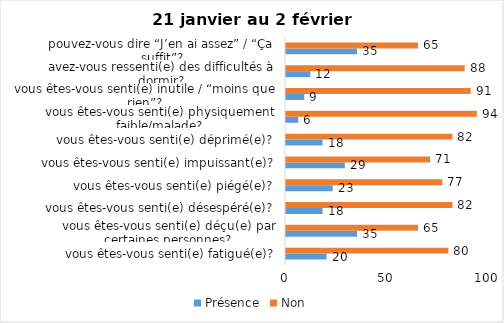
| Category | Présence | Non |
|---|---|---|
| vous êtes-vous senti(e) fatigué(e)? | 20 | 80 |
| vous êtes-vous senti(e) déçu(e) par certaines personnes? | 35 | 65 |
| vous êtes-vous senti(e) désespéré(e)? | 18 | 82 |
| vous êtes-vous senti(e) piégé(e)? | 23 | 77 |
| vous êtes-vous senti(e) impuissant(e)? | 29 | 71 |
| vous êtes-vous senti(e) déprimé(e)? | 18 | 82 |
| vous êtes-vous senti(e) physiquement faible/malade? | 6 | 94 |
| vous êtes-vous senti(e) inutile / “moins que rien”? | 9 | 91 |
| avez-vous ressenti(e) des difficultés à dormir? | 12 | 88 |
| pouvez-vous dire “J’en ai assez” / “Ça suffit”? | 35 | 65 |